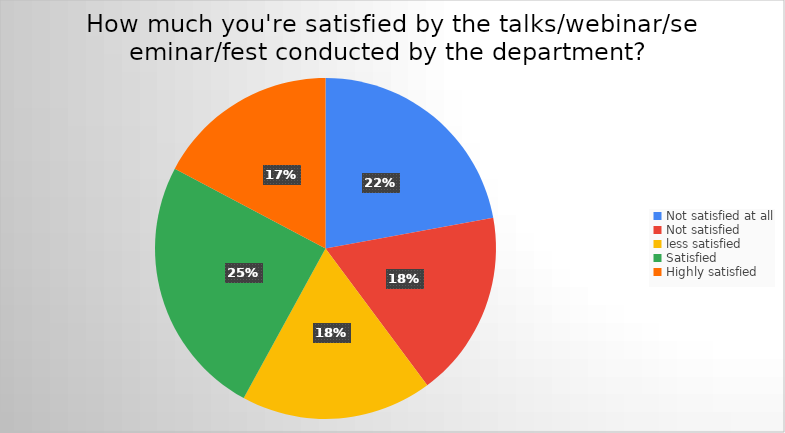
| Category | Series 0 |
|---|---|
| Not satisfied at all | 50 |
| Not satisfied  | 40 |
| less satisfied | 41 |
| Satisfied | 56 |
| Highly satisfied | 39 |